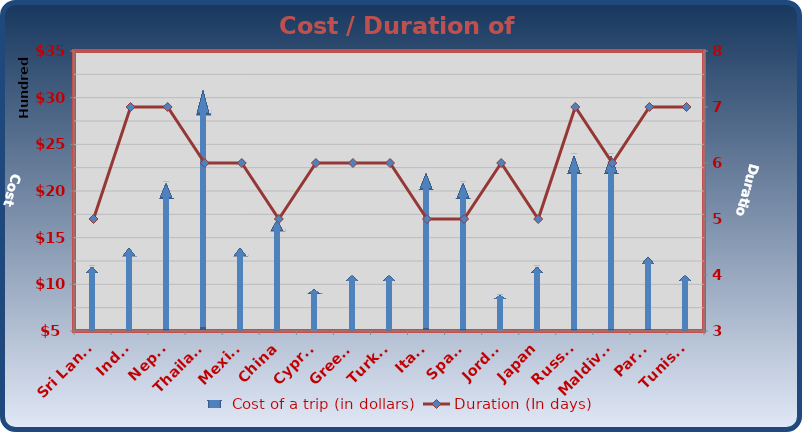
| Category | Cost of a trip (in dollars) |
|---|---|
| Sri Lanka | 1200 |
| India | 1400 |
| Nepal | 2100 |
| Thailand | 3100 |
| Mexico | 1400 |
| China | 1700 |
| Cyprus | 950 |
| Greece | 1100 |
| Turkey | 1100 |
| Italy | 2200 |
| Spain | 2100 |
| Jordan | 890 |
| Japan | 1200 |
| Russia | 2400 |
| Maldives | 2400 |
| Paris | 1300 |
| Tunisia | 1100 |